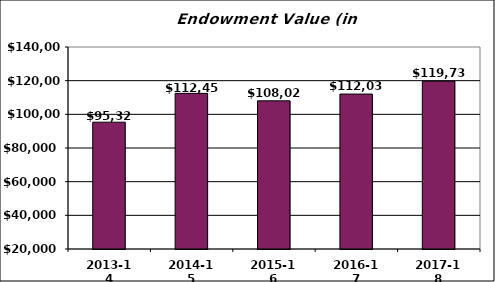
| Category | Value ($000) |
|---|---|
| 2013-14 | 95329 |
| 2014-15 | 112451 |
| 2015-16 | 108027 |
| 2016-17 | 112034 |
| 2017-18 | 119731 |